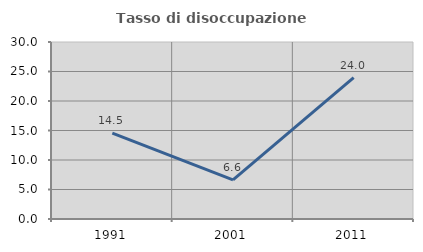
| Category | Tasso di disoccupazione giovanile  |
|---|---|
| 1991.0 | 14.55 |
| 2001.0 | 6.642 |
| 2011.0 | 23.963 |